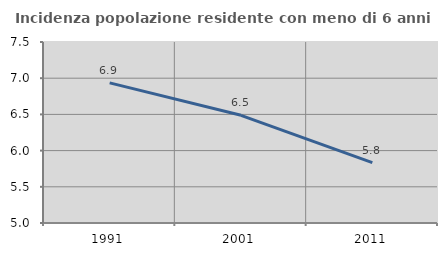
| Category | Incidenza popolazione residente con meno di 6 anni |
|---|---|
| 1991.0 | 6.936 |
| 2001.0 | 6.487 |
| 2011.0 | 5.834 |